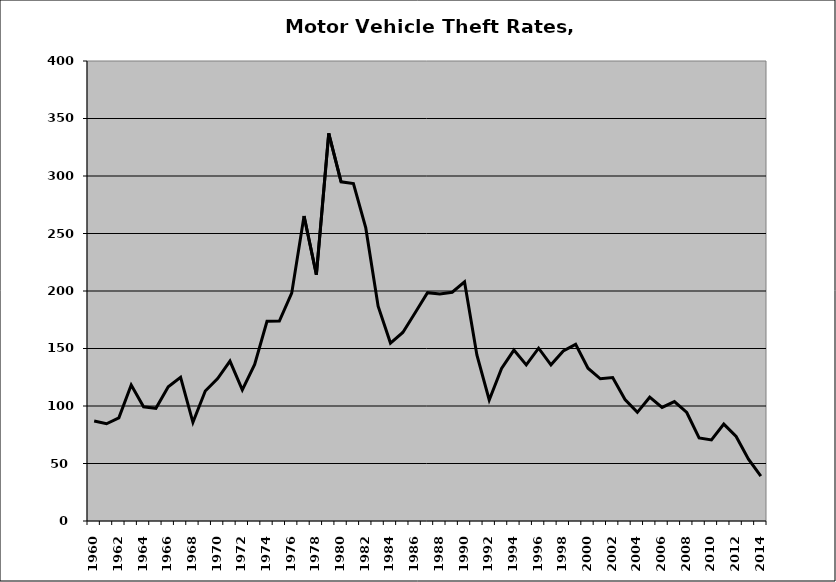
| Category | Motor Vehicle |
|---|---|
| 1960.0 | 86.95 |
| 1961.0 | 84.557 |
| 1962.0 | 89.744 |
| 1963.0 | 118.205 |
| 1964.0 | 99.267 |
| 1965.0 | 97.985 |
| 1966.0 | 116.79 |
| 1967.0 | 124.94 |
| 1968.0 | 85.782 |
| 1969.0 | 112.984 |
| 1970.0 | 123.895 |
| 1971.0 | 139.083 |
| 1972.0 | 114.069 |
| 1973.0 | 136.207 |
| 1974.0 | 173.617 |
| 1975.0 | 173.885 |
| 1976.0 | 198.109 |
| 1977.0 | 265.217 |
| 1978.0 | 214.168 |
| 1979.0 | 337.12 |
| 1980.0 | 294.935 |
| 1981.0 | 293.398 |
| 1982.0 | 254.845 |
| 1983.0 | 186.857 |
| 1984.0 | 154.717 |
| 1985.0 | 163.925 |
| 1986.0 | 181.146 |
| 1987.0 | 198.54 |
| 1988.0 | 197.302 |
| 1989.0 | 198.942 |
| 1990.0 | 207.905 |
| 1991.0 | 144.444 |
| 1992.0 | 105.263 |
| 1993.0 | 132.639 |
| 1994.0 | 148.621 |
| 1995.0 | 135.726 |
| 1996.0 | 150.255 |
| 1997.0 | 135.823 |
| 1998.0 | 147.885 |
| 1999.0 | 153.603 |
| 2000.0 | 132.878 |
| 2001.0 | 123.659 |
| 2002.0 | 124.755 |
| 2003.0 | 105.596 |
| 2004.0 | 94.49 |
| 2005.0 | 107.65 |
| 2006.0 | 98.733 |
| 2007.0 | 103.822 |
| 2008.0 | 94.356 |
| 2009.0 | 72.214 |
| 2010.0 | 70.476 |
| 2011.0 | 84.265 |
| 2012.0 | 73.488 |
| 2013.0 | 53.76 |
| 2014.0 | 38.943 |